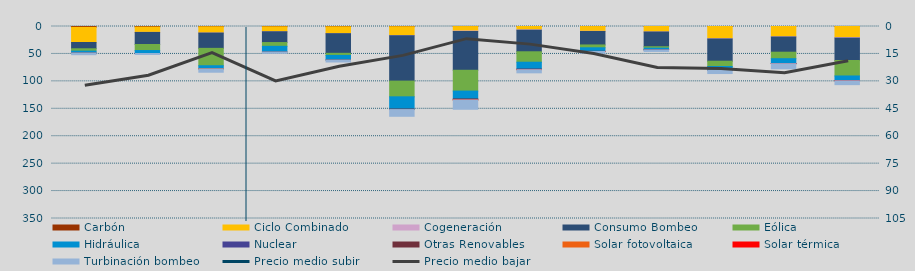
| Category | Carbón | Ciclo Combinado | Cogeneración | Consumo Bombeo | Eólica | Hidráulica | Nuclear | Otras Renovables | Solar fotovoltaica | Solar térmica | Turbinación bombeo |
|---|---|---|---|---|---|---|---|---|---|---|---|
| O | 1567.5 | 27564.7 | 0 | 11468.6 | 4269.6 | 3292.2 | 0 | 125.3 | 0 | 0 | 3130.6 |
| N | 1032.3 | 9659.8 | 141 | 22022.6 | 10965.1 | 5345.6 | 22.6 | 8.3 | 0 | 0 | 1780.7 |
| D | 528.1 | 11341.1 | 86.5 | 27911.2 | 31665.4 | 5608.2 | 0 | 173.7 | 5.9 | 0 | 6026.2 |
| E | 543.5 | 9049.8 | 14.2 | 19673 | 6854.8 | 10347.8 | 0 | 7.7 | 0 | 0 | 2307.6 |
| F | 538.4 | 12495.4 | 57.7 | 35793.2 | 3820.7 | 8168.3 | 0 | 265.3 | 0 | 0 | 3575.3 |
| M | 386.4 | 15979.9 | 321.7 | 82837 | 28654.5 | 22332.5 | 0 | 917.9 | 0 | 0 | 12258.3 |
| A | 97.2 | 8073.6 | 752.2 | 70876 | 37936.3 | 14340.4 | 0 | 1671.6 | 79.6 | 6.4 | 17035.3 |
| M | 18.3 | 6034.6 | 724.9 | 39295.9 | 19044.2 | 12773.5 | 8 | 691.1 | 39.5 | 82.2 | 5747.6 |
| J | 76.6 | 8592.1 | 398.7 | 24576 | 5144.6 | 6431.8 | 0 | 324 | 34.6 | 38.7 | 3246.7 |
| J | 1 | 9886.9 | 142.6 | 26857.1 | 2569.3 | 2887.6 | 128.7 | 129.9 | 0 | 0 | 2875.8 |
| A | 0.8 | 22172.7 | 585.5 | 40530.6 | 9585.7 | 6785.6 | 0 | 88.9 | 0 | 0 | 6008 |
| S | 48.5 | 18683.2 | 429.6 | 27697.3 | 11818.5 | 8778.9 | 227.5 | 47.7 | 0 | 6.7 | 9356.6 |
| O | 25.6 | 20171.4 | 982.8 | 40815.4 | 28187.3 | 8723.5 | 0 | 22.2 | 0 | 12.6 | 7047.9 |